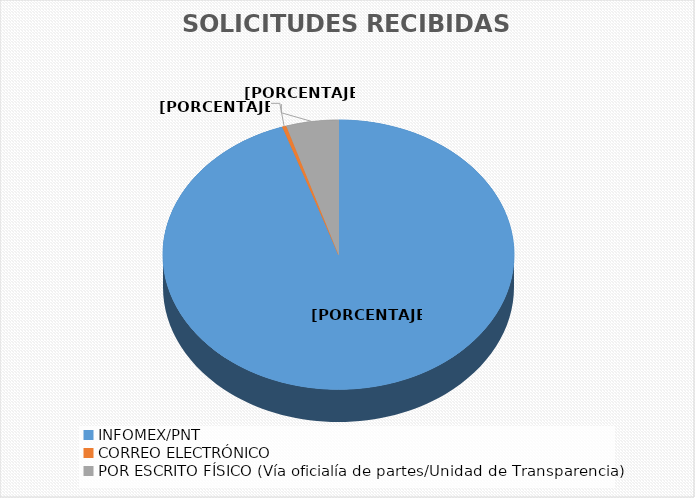
| Category | Series 0 |
|---|---|
| INFOMEX/PNT | 3229 |
| CORREO ELECTRÓNICO | 13 |
| POR ESCRITO FÍSICO (Vía oficialía de partes/Unidad de Transparencia) | 164 |